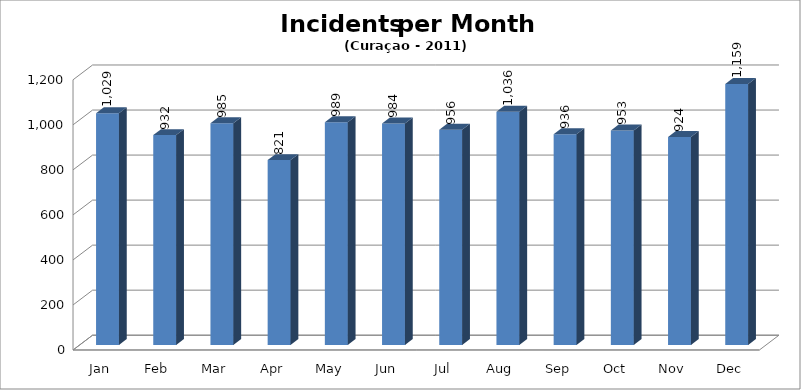
| Category | Series 0 |
|---|---|
| Jan | 1029 |
| Feb | 932 |
| Mar | 985 |
| Apr | 821 |
| May | 989 |
| Jun | 984 |
| Jul | 956 |
| Aug | 1036 |
| Sep | 936 |
| Oct | 953 |
| Nov | 924 |
| Dec | 1159 |